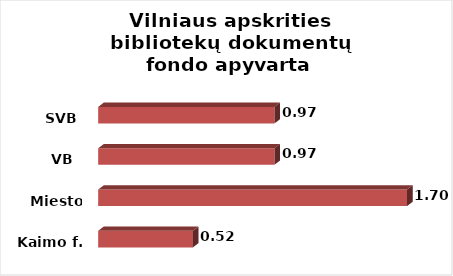
| Category | Series 0 |
|---|---|
| Kaimo f. | 0.52 |
| Miesto f. | 1.696 |
| VB  | 0.968 |
| SVB | 0.968 |